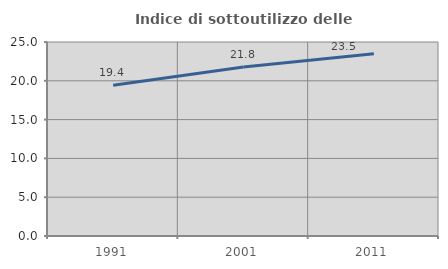
| Category | Indice di sottoutilizzo delle abitazioni  |
|---|---|
| 1991.0 | 19.427 |
| 2001.0 | 21.78 |
| 2011.0 | 23.484 |